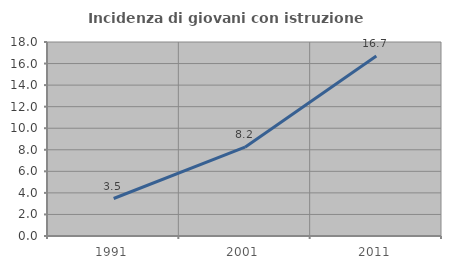
| Category | Incidenza di giovani con istruzione universitaria |
|---|---|
| 1991.0 | 3.478 |
| 2001.0 | 8.243 |
| 2011.0 | 16.699 |